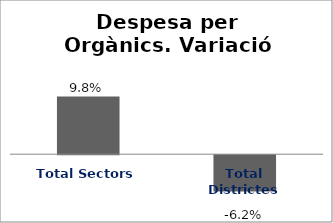
| Category | Series 0 |
|---|---|
| Total Sectors | 0.098 |
| Total Districtes | -0.062 |